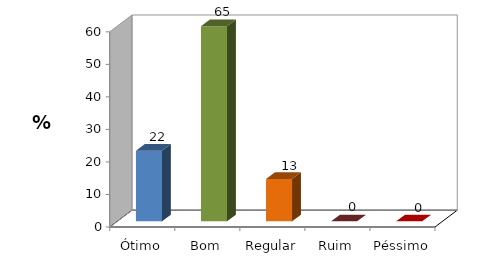
| Category | Series 0 |
|---|---|
| Ótimo | 21.739 |
| Bom | 65.217 |
| Regular | 13.043 |
| Ruim | 0 |
| Péssimo | 0 |